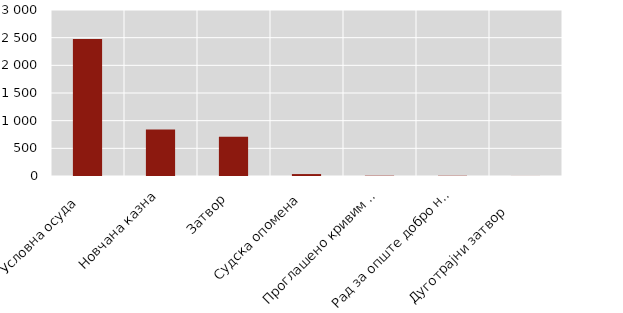
| Category | Series 0 |
|---|---|
| Условна осуда   | 2476 |
| Новчана казна | 840 |
| Затвор  | 709 |
| Судска опомена  | 35 |
| Проглашено кривим а ослобођено од казне  | 6 |
| Рад за опште добро на слободи  | 5 |
| Дуготрајни затвор      | 1 |